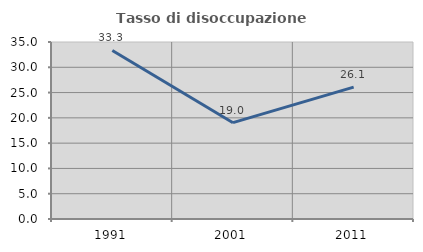
| Category | Tasso di disoccupazione giovanile  |
|---|---|
| 1991.0 | 33.333 |
| 2001.0 | 19.048 |
| 2011.0 | 26.087 |